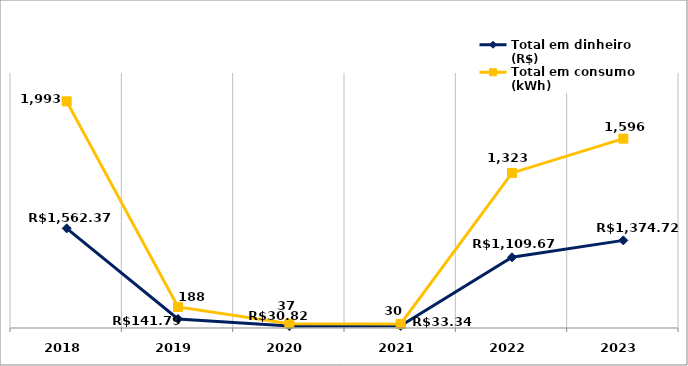
| Category | Total em dinheiro (R$) | Total em consumo (kWh) |
|---|---|---|
| 2018.0 | 1562.37 | 1993 |
| 2019.0 | 141.79 | 188 |
| 2020.0 | 30.82 | 37 |
| 2021.0 | 33.34 | 30 |
| 2022.0 | 1109.67 | 1323 |
| 2023.0 | 1374.72 | 1596 |